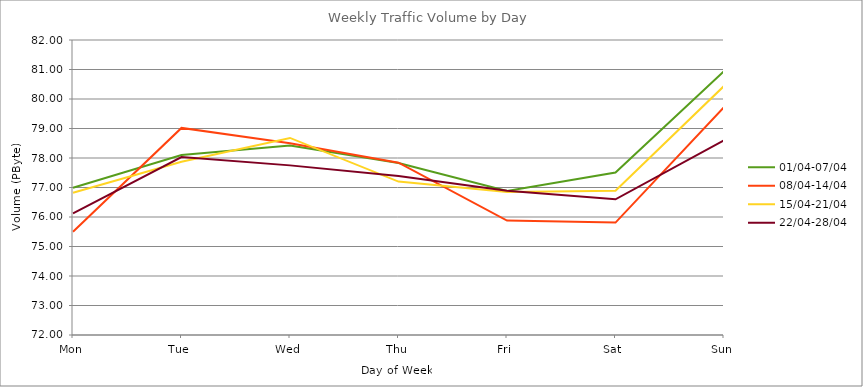
| Category | 01/04-07/04 | 08/04-14/04 | 15/04-21/04 | 22/04-28/04 |
|---|---|---|---|---|
| Mon | 76.99 | 75.5 | 76.82 | 76.12 |
| Tue | 78.1 | 79.02 | 77.87 | 78.03 |
| Wed | 78.42 | 78.5 | 78.68 | 77.75 |
| Thu | 77.83 | 77.84 | 77.2 | 77.39 |
| Fri | 76.88 | 75.88 | 76.85 | 76.89 |
| Sat | 77.51 | 75.81 | 76.89 | 76.6 |
| Sun | 80.94 | 79.72 | 80.44 | 78.6 |